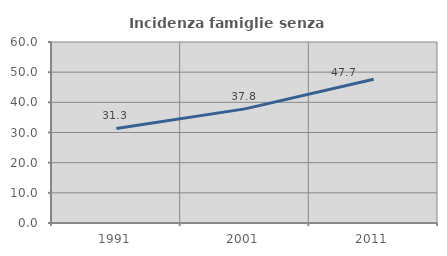
| Category | Incidenza famiglie senza nuclei |
|---|---|
| 1991.0 | 31.343 |
| 2001.0 | 37.826 |
| 2011.0 | 47.653 |